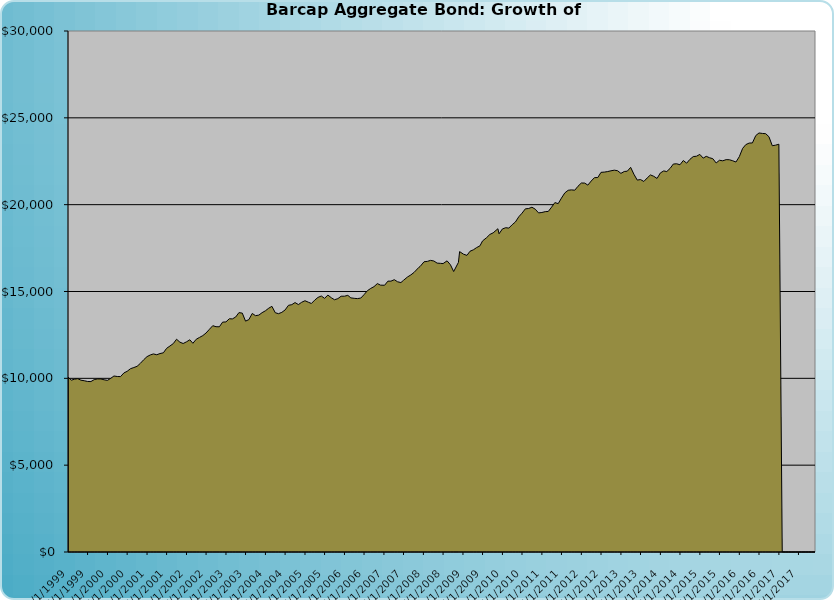
| Category | S&P500 |
|---|---|
| 12/1/17 | 0 |
| 11/1/17 | 0 |
| 10/1/17 | 0 |
| 9/1/17 | 0 |
| 8/1/17 | 0 |
| 7/1/17 | 0 |
| 6/1/17 | 0 |
| 5/1/17 | 0 |
| 4/1/17 | 0 |
| 3/1/17 | 0 |
| 2/1/17 | 0 |
| 1/1/17 | 23479.798 |
| 12/1/16 | 23425.918 |
| 11/1/16 | 23393.168 |
| 10/1/16 | 23912.059 |
| 9/1/16 | 24087.901 |
| 8/1/16 | 24102.362 |
| 7/1/16 | 24128.904 |
| 6/1/16 | 23977.844 |
| 5/1/16 | 23553.874 |
| 4/1/16 | 23546.81 |
| 3/1/16 | 23457.671 |
| 2/1/16 | 23243.828 |
| 1/1/16 | 22765.747 |
| 12/1/15 | 22455.856 |
| 11/1/15 | 22527.945 |
| 10/1/15 | 22586.671 |
| 9/1/15 | 22593.449 |
| 8/1/15 | 22525.871 |
| 7/1/15 | 22557.452 |
| 6/1/15 | 22400.647 |
| 5/1/15 | 22647.505 |
| 4/1/15 | 22701.99 |
| 3/1/15 | 22784.012 |
| 2/1/15 | 22679.686 |
| 1/1/15 | 22894.898 |
| 12/1/14 | 22790.063 |
| 11/1/14 | 22769.571 |
| 10/1/14 | 22609.047 |
| 9/1/14 | 22389.628 |
| 8/1/14 | 22542.92 |
| 7/1/14 | 22297.646 |
| 6/1/14 | 22353.53 |
| 5/1/14 | 22342.359 |
| 4/1/14 | 22090.527 |
| 3/1/14 | 21906.512 |
| 2/1/14 | 21943.816 |
| 1/1/14 | 21828.127 |
| 12/1/13 | 21509.782 |
| 11/1/13 | 21633.091 |
| 10/1/13 | 21713.431 |
| 9/1/13 | 21538.965 |
| 8/1/13 | 21336.271 |
| 7/1/13 | 21445.643 |
| 6/1/13 | 21415.661 |
| 5/1/13 | 21752.83 |
| 4/1/13 | 22149.303 |
| 3/1/13 | 21927.832 |
| 2/1/13 | 21910.304 |
| 1/1/13 | 21801.297 |
| 12/1/12 | 21954.982 |
| 11/1/12 | 21985.762 |
| 10/1/12 | 21950.641 |
| 9/1/12 | 21906.827 |
| 8/1/12 | 21876.201 |
| 7/1/12 | 21860.898 |
| 6/1/12 | 21563.324 |
| 5/1/12 | 21554.702 |
| 4/1/12 | 21360.323 |
| 3/1/12 | 21125.827 |
| 2/1/12 | 21242.661 |
| 1/1/12 | 21246.911 |
| 12/1/11 | 21061.569 |
| 11/1/11 | 20832.412 |
| 10/1/11 | 20851.178 |
| 9/1/11 | 20828.267 |
| 8/1/11 | 20677.323 |
| 7/1/11 | 20379.778 |
| 6/1/11 | 20060.811 |
| 5/1/11 | 20119.157 |
| 4/1/11 | 19859.004 |
| 3/1/11 | 19609.957 |
| 2/1/11 | 19598.198 |
| 1/1/11 | 19549.325 |
| 12/1/10 | 19525.894 |
| 11/1/10 | 19739.076 |
| 10/1/10 | 19852.234 |
| 9/1/10 | 19781.022 |
| 8/1/10 | 19759.287 |
| 7/1/10 | 19507.638 |
| 6/1/10 | 19301.116 |
| 5/1/10 | 19002.773 |
| 4/1/10 | 18844.479 |
| 3/1/10 | 18650.514 |
| 2/1/10 | 18672.921 |
| 1/1/10 | 18604.086 |
| 12/1/09 | 18323.733 |
| 11/20/09 | 18614.113 |
| 10/7/09 | 18377.049 |
| 9/7/09 | 18287.441 |
| 8/7/09 | 18097.418 |
| 7/1/09 | 17911.142 |
| 6/7/09 | 17627.342 |
| 5/7/09 | 17527.436 |
| 4/7/09 | 17400.413 |
| 3/7/09 | 17317.29 |
| 2/7/09 | 17079.879 |
| 1/7/09 | 17145.03 |
| 12/1/08 | 17297.246 |
| 11/20/08 | 16675.259 |
| 10/7/08 | 16150.372 |
| 9/7/08 | 16540.733 |
| 8/7/08 | 16765.389 |
| 7/1/08 | 16607.617 |
| 6/7/08 | 16620.914 |
| 5/7/08 | 16634.221 |
| 4/7/08 | 16756.544 |
| 3/7/08 | 16791.807 |
| 2/7/08 | 16734.908 |
| 1/7/08 | 16711.512 |
| 12/1/07 | 16435.397 |
| 11/20/07 | 16389.507 |
| 10/7/07 | 16099.712 |
| 9/7/07 | 15956.107 |
| 8/7/07 | 15835.755 |
| 7/1/07 | 15643.342 |
| 6/7/07 | 15514.571 |
| 5/7/07 | 15561.255 |
| 4/7/07 | 15680.426 |
| 3/7/07 | 15596.207 |
| 2/7/07 | 15596.207 |
| 1/7/07 | 15359.668 |
| 12/1/06 | 15365.814 |
| 11/1/06 | 15455.456 |
| 10/1/06 | 15278.228 |
| 9/1/06 | 15178.053 |
| 8/1/06 | 15045.651 |
| 7/1/06 | 14818.922 |
| 6/1/06 | 14621.531 |
| 5/1/06 | 14590.89 |
| 4/1/06 | 14606.958 |
| 3/1/06 | 14633.298 |
| 2/1/06 | 14778.123 |
| 1/1/06 | 14729.516 |
| 12/1/05 | 14728.043 |
| 11/1/05 | 14589.444 |
| 10/1/05 | 14525.531 |
| 9/1/05 | 14641.197 |
| 8/1/05 | 14793.57 |
| 7/1/05 | 14606.606 |
| 6/1/05 | 14740.747 |
| 5/1/05 | 14660.116 |
| 4/1/05 | 14503.478 |
| 3/1/05 | 14310.29 |
| 2/1/05 | 14383.646 |
| 1/1/05 | 14469.013 |
| 12/1/04 | 14378.429 |
| 11/1/04 | 14247.354 |
| 10/1/04 | 14362.252 |
| 9/1/04 | 14242.614 |
| 8/1/04 | 14204.262 |
| 7/1/04 | 13938.045 |
| 6/1/04 | 13801.411 |
| 5/1/04 | 13723.189 |
| 4/1/04 | 13778.302 |
| 3/1/04 | 14146.101 |
| 2/1/04 | 14040.795 |
| 1/1/04 | 13890.775 |
| 12/1/03 | 13780.531 |
| 11/1/03 | 13641.388 |
| 10/1/03 | 13608.727 |
| 9/1/03 | 13736.477 |
| 8/1/03 | 13381.857 |
| 7/1/03 | 13294.116 |
| 6/1/03 | 13756.329 |
| 5/1/03 | 13783.897 |
| 4/1/03 | 13532.198 |
| 3/1/03 | 13420.805 |
| 2/1/03 | 13431.55 |
| 1/1/03 | 13248.718 |
| 12/1/02 | 13236.805 |
| 11/1/02 | 12968.36 |
| 10/1/02 | 12972.252 |
| 9/1/02 | 13032.2 |
| 8/1/02 | 12824.444 |
| 7/1/02 | 12611.313 |
| 6/1/02 | 12460.54 |
| 5/1/02 | 12354.293 |
| 4/1/02 | 12250.167 |
| 3/1/02 | 12017.036 |
| 2/1/02 | 12219.886 |
| 1/1/02 | 12102.492 |
| 12/1/01 | 12005.25 |
| 11/1/01 | 12082.578 |
| 10/1/01 | 12251.651 |
| 9/1/01 | 12000.833 |
| 8/1/01 | 11862.047 |
| 7/1/01 | 11727.185 |
| 6/1/01 | 11470.251 |
| 5/1/01 | 11426.829 |
| 4/1/01 | 11358.677 |
| 3/1/01 | 11405.44 |
| 2/1/01 | 11348.696 |
| 1/1/01 | 11250.814 |
| 12/1/00 | 11069.278 |
| 11/1/00 | 10867.149 |
| 10/1/00 | 10691.803 |
| 9/1/00 | 10621.7 |
| 8/1/00 | 10555.202 |
| 7/1/00 | 10404.339 |
| 6/1/00 | 10310.514 |
| 5/1/00 | 10100.425 |
| 4/1/00 | 10105.478 |
| 3/1/00 | 10134.869 |
| 2/1/00 | 10002.831 |
| 1/1/00 | 9883.244 |
| 12/1/99 | 9915.967 |
| 11/1/99 | 9963.793 |
| 10/1/99 | 9964.789 |
| 9/1/99 | 9928.056 |
| 8/1/99 | 9814.211 |
| 7/1/99 | 9819.12 |
| 6/1/99 | 9861.525 |
| 5/1/99 | 9893.183 |
| 4/1/99 | 9981.016 |
| 3/1/99 | 9949.179 |
| 2/1/99 | 9894.758 |
| 1/1/99 | 10071 |